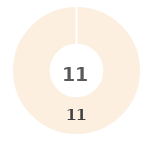
| Category | Series 0 |
|---|---|
| 0 | 0 |
| 1 | 0 |
| 2 | 0 |
| 3 | 0 |
| 4 | 11 |